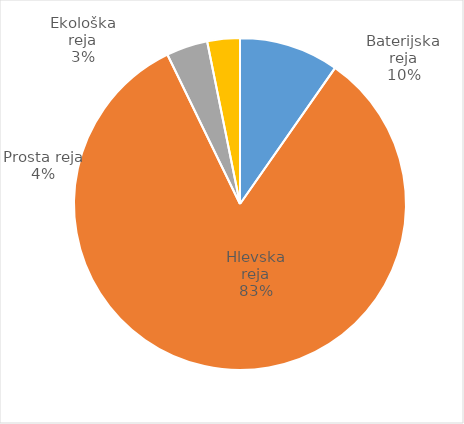
| Category | Število kosov jajc |
|---|---|
| Baterijska reja | 298880 |
| Hlevska reja | 2559124 |
| Prosta reja | 123924 |
| Ekološka reja | 97800 |